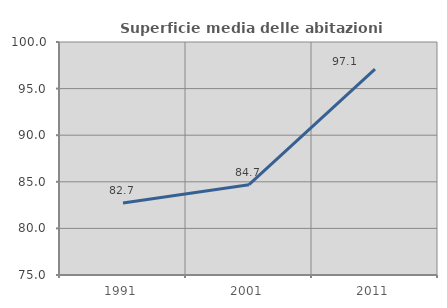
| Category | Superficie media delle abitazioni occupate |
|---|---|
| 1991.0 | 82.732 |
| 2001.0 | 84.693 |
| 2011.0 | 97.088 |